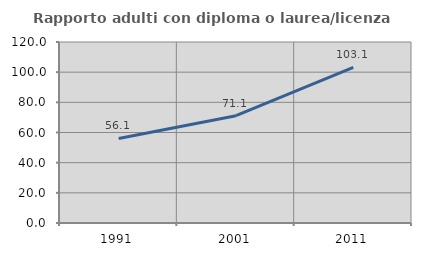
| Category | Rapporto adulti con diploma o laurea/licenza media  |
|---|---|
| 1991.0 | 56.075 |
| 2001.0 | 71.123 |
| 2011.0 | 103.134 |